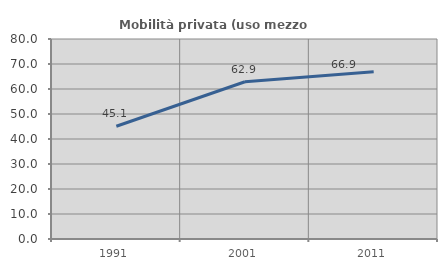
| Category | Mobilità privata (uso mezzo privato) |
|---|---|
| 1991.0 | 45.083 |
| 2001.0 | 62.907 |
| 2011.0 | 66.91 |